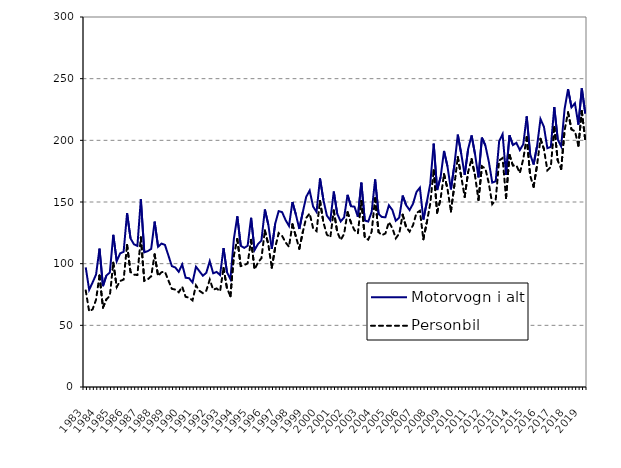
| Category | Motorvogn i alt | Personbil |
|---|---|---|
| 1983.0 | 97 | 78.3 |
| nan | 78.8 | 61.3 |
| nan | 84.8 | 63 |
| nan | 91.2 | 70.8 |
| 1984.0 | 112.2 | 90.4 |
| nan | 81.8 | 64.4 |
| nan | 90.4 | 71.1 |
| nan | 92.9 | 73.9 |
| 1985.0 | 123.4 | 100.8 |
| nan | 102 | 81.1 |
| nan | 108.4 | 86 |
| nan | 109.6 | 87.1 |
| 1986.0 | 141 | 115.2 |
| nan | 120.5 | 93.2 |
| nan | 115.7 | 91.1 |
| nan | 114.4 | 90.8 |
| 1987.0 | 152.2 | 121.3 |
| nan | 109.2 | 86.1 |
| nan | 110.1 | 87.3 |
| nan | 112 | 89.8 |
| 1988.0 | 134.1 | 107.5 |
| nan | 113.7 | 90 |
| nan | 116.3 | 93.1 |
| nan | 115.2 | 93.4 |
| 1989.0 | 106.6 | 86.4 |
| nan | 98 | 79.6 |
| nan | 96.9 | 79 |
| nan | 93.4 | 76.8 |
| 1990.0 | 99.4 | 81.3 |
| nan | 88.6 | 73.1 |
| nan | 88.2 | 72.5 |
| nan | 84.8 | 70.2 |
| 1991.0 | 97.5 | 82.4 |
| nan | 93.9 | 78 |
| nan | 90.2 | 76.1 |
| nan | 92.6 | 78.1 |
| 1992.0 | 102 | 87.1 |
| nan | 92.2 | 78.9 |
| nan | 93.3 | 79.9 |
| nan | 90.8 | 77.6 |
| 1993.0 | 112.6 | 96.5 |
| nan | 93 | 80.1 |
| nan | 87.5 | 73.6 |
| nan | 120.1 | 106.6 |
| 1994.0 | 138.4 | 120 |
| nan | 114.5 | 98.1 |
| nan | 112.8 | 98.8 |
| nan | 114.5 | 100.2 |
| 1995.0 | 137.2 | 119.3 |
| nan | 111 | 95.4 |
| nan | 115.9 | 101 |
| nan | 118.8 | 104.4 |
| 1996.0 | 143.9 | 126.9 |
| nan | 131.6 | 115.7 |
| nan | 112 | 96.7 |
| nan | 132.5 | 113.1 |
| 1997.0 | 142.6 | 124.8 |
| nan | 141.8 | 122.5 |
| nan | 135.4 | 117.3 |
| nan | 130.6 | 113.7 |
| 1998.0 | 150 | 131.9 |
| nan | 139.8 | 122 |
| nan | 128.1 | 112.1 |
| nan | 141.8 | 125.6 |
| 1999.0 | 154.2 | 137.1 |
| nan | 159.3 | 140.7 |
| nan | 146.3 | 128.7 |
| nan | 141.9 | 126.4 |
| 2000.0 | 169.1 | 150.9 |
| nan | 151.5 | 133.4 |
| nan | 139 | 123.5 |
| nan | 135.1 | 121.4 |
| 2001.0 | 158.5 | 143.1 |
| nan | 140.46 | 125.7 |
| nan | 134.24 | 119.2 |
| nan | 137.495 | 124.072 |
| 2002.0 | 155.814 | 141.724 |
| nan | 146.543 | 133.19 |
| nan | 146.231 | 127.141 |
| nan | 137.967 | 124.641 |
| 2003.0 | 165.679 | 150.811 |
| nan | 135.021 | 121.101 |
| nan | 134.111 | 119.491 |
| nan | 142.013 | 125.959 |
| 2004.0 | 168.309 | 153.043 |
| nan | 140.267 | 125.568 |
| nan | 137.77 | 123.121 |
| nan | 137.685 | 124.506 |
| 2005.0 | 147.311 | 133.756 |
| nan | 143.517 | 128.79 |
| nan | 134.783 | 120.571 |
| nan | 137.37 | 124.382 |
| 2006.0 | 155.213 | 139.728 |
| nan | 147.444 | 129.572 |
| nan | 143.451 | 126.006 |
| nan | 148.561 | 131.195 |
| 2007.0 | 158.1 | 141.084 |
| nan | 161.613 | 142.897 |
| nan | 135.821 | 119.753 |
| nan | 149.791 | 133.498 |
| 2008.0 | 164.642 | 148.614 |
| nan | 197.287 | 175.714 |
| nan | 159.718 | 141.407 |
| nan | 170.057 | 152.54 |
| 2009.0 | 191.38 | 172.559 |
| nan | 178.906 | 160.765 |
| nan | 160.234 | 142.312 |
| nan | 179.857 | 163.532 |
| 2010.0 | 204.636 | 186.507 |
| nan | 188.957 | 170.463 |
| nan | 172.077 | 154.156 |
| nan | 192.961 | 174.399 |
| 2011.0 | 204.005 | 184.86 |
| nan | 188.741 | 171.333 |
| nan | 169.934 | 151.694 |
| nan | 202.176 | 178.919 |
| 2012.0 | 195.829 | 177.072 |
| nan | 182.751 | 165.128 |
| nan | 165.73 | 148.242 |
| nan | 166.805 | 151.728 |
| 2013.0 | 199.181 | 183.653 |
| nan | 205.015 | 185.634 |
| nan | 172.044 | 153.21 |
| nan | 204.1 | 188.079 |
| 2014.0 | 196.177 | 179.552 |
| nan | 197.965 | 179.767 |
| nan | 192.105 | 173.474 |
| nan | 196.809 | 184.739 |
| 2015.0 | 219.419 | 202.592 |
| nan | 188.696 | 171.451 |
| nan | 180.388 | 162.297 |
| nan | 195.23 | 179.891 |
| 2016.0 | 217.298 | 201.197 |
| nan | 210.949 | 192.893 |
| nan | 193.648 | 175.642 |
| nan | 194.663 | 178.455 |
| 2017.0 | 227.029 | 210.738 |
| nan | 200.767 | 183.708 |
| nan | 195.059 | 176.766 |
| nan | 225.423 | 208.218 |
| 2018.0 | 241.528 | 222.678 |
| nan | 226.771 | 208.839 |
| nan | 230.044 | 207.395 |
| nan | 212.667 | 195.666 |
| 2019.0 | 242.056 | 223.584 |
| nan | 221.711 | 199.972 |